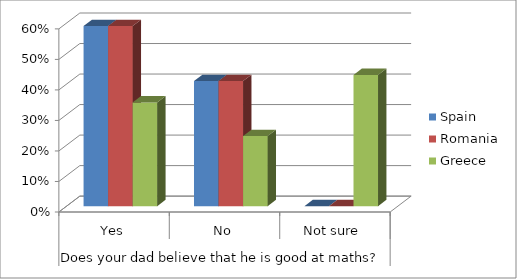
| Category | Spain | Romania | Greece |
|---|---|---|---|
| 0 | 0.59 | 0.59 | 0.34 |
| 1 | 0.41 | 0.41 | 0.23 |
| 2 | 0 | 0 | 0.43 |